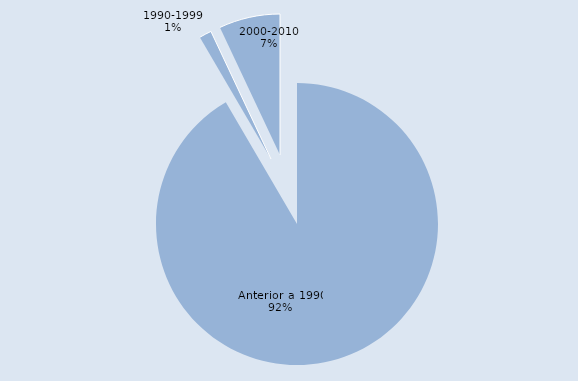
| Category | N |
|---|---|
| Anterior a 1990 | 126352 |
| 1990-1999 | 1960 |
| 2000-2010 | 9661 |